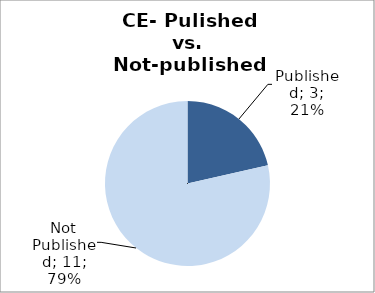
| Category | Series 0 |
|---|---|
| Published | 3 |
| Not Published | 11 |